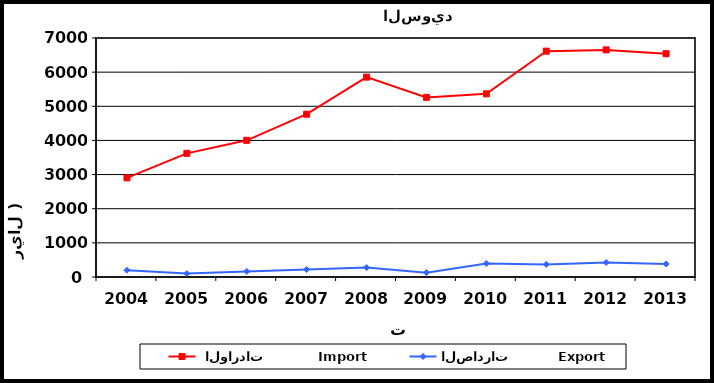
| Category |  الواردات           Import | الصادرات          Export |
|---|---|---|
| 2004.0 | 2904 | 199 |
| 2005.0 | 3622 | 99 |
| 2006.0 | 4004 | 163 |
| 2007.0 | 4768 | 219 |
| 2008.0 | 5854 | 275 |
| 2009.0 | 5261 | 128 |
| 2010.0 | 5365 | 395 |
| 2011.0 | 6615 | 369 |
| 2012.0 | 6652 | 426 |
| 2013.0 | 6540 | 384 |